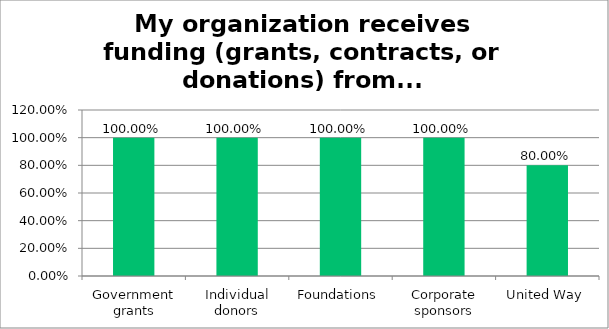
| Category | Responses |
|---|---|
| Government grants | 1 |
| Individual donors | 1 |
| Foundations | 1 |
| Corporate sponsors | 1 |
| United Way | 0.8 |